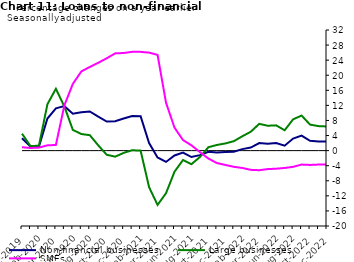
| Category | zero | Non-financial businesses | Large businesses | SMEs |
|---|---|---|---|---|
| Dec-2019 | 0 | 3.3 | 4.5 | 0.9 |
| Jan-2020 | 0 | 1.1 | 1.2 | 0.7 |
| Feb-2020 | 0 | 1.1 | 1.3 | 0.8 |
| Mar-2020 | 0 | 8.5 | 12.3 | 1.4 |
| Apr-2020 | 0 | 11.2 | 16.4 | 1.5 |
| May-2020 | 0 | 11.8 | 11.7 | 12 |
| Jun-2020 | 0 | 9.8 | 5.5 | 17.7 |
| Jul-2020 | 0 | 10.2 | 4.4 | 21 |
| Aug-2020 | 0 | 10.4 | 4.1 | 22.2 |
| Sep-2020 | 0 | 9 | 1.4 | 23.3 |
| Oct-2020 | 0 | 7.7 | -1.1 | 24.5 |
| Nov-2020 | 0 | 7.8 | -1.6 | 25.8 |
| Dec-2020 | 0 | 8.5 | -0.6 | 25.9 |
| Jan-2021 | 0 | 9.2 | 0.1 | 26.2 |
| Feb-2021 | 0 | 9.1 | 0 | 26.2 |
| Mar-2021 | 0 | 2 | -9.7 | 26 |
| Apr-2021 | 0 | -1.8 | -14.4 | 25.4 |
| May-2021 | 0 | -3 | -11.3 | 12.7 |
| Jun-2021 | 0 | -1.3 | -5.6 | 6.1 |
| Jul-2021 | 0 | -0.5 | -2.5 | 2.8 |
| Aug-2021 | 0 | -1.7 | -3.6 | 1.4 |
| Sep-2021 | 0 | -1.2 | -1.7 | -0.4 |
| Oct-2021 | 0 | -0.3 | 0.9 | -2.1 |
| Nov-2021 | 0 | -0.5 | 1.5 | -3.3 |
| Dec-2021 | 0 | -0.4 | 1.9 | -3.8 |
| Jan-2022 | 0 | -0.3 | 2.5 | -4.3 |
| Feb-2022 | 0 | 0.4 | 3.8 | -4.6 |
| Mar-2022 | 0 | 0.8 | 5 | -5.1 |
| Apr-2022 | 0 | 2 | 7.1 | -5.2 |
| May-2022 | 0 | 1.8 | 6.6 | -4.9 |
| Jun-2022 | 0 | 2 | 6.7 | -4.8 |
| Jul-2022 | 0 | 1.3 | 5.4 | -4.6 |
| Aug-2022 | 0 | 3.2 | 8.3 | -4.3 |
| Sep-2022 | 0 | 4 | 9.3 | -3.7 |
| Oct-2022 | 0 | 2.6 | 6.9 | -3.8 |
| Nov-2022 | 0 | 2.4 | 6.5 | -3.7 |
| Dec-2022 | 0 | 2.4 | 6.4 | -3.7 |